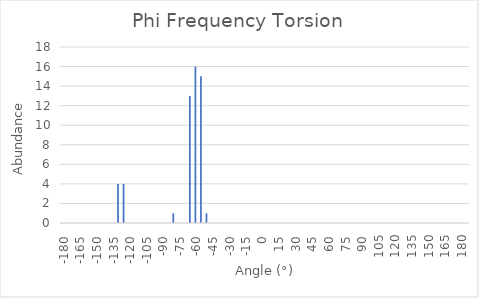
| Category | Series 0 |
|---|---|
| -180.0 | 0 |
| -175.0 | 0 |
| -170.0 | 0 |
| -165.0 | 0 |
| -160.0 | 0 |
| -155.0 | 0 |
| -150.0 | 0 |
| -145.0 | 0 |
| -140.0 | 0 |
| -135.0 | 0 |
| -130.0 | 4 |
| -125.0 | 4 |
| -120.0 | 0 |
| -115.0 | 0 |
| -110.0 | 0 |
| -105.0 | 0 |
| -100.0 | 0 |
| -95.0 | 0 |
| -90.0 | 0 |
| -85.0 | 0 |
| -80.0 | 1 |
| -75.0 | 0 |
| -70.0 | 0 |
| -65.0 | 13 |
| -60.0 | 16 |
| -55.0 | 15 |
| -50.0 | 1 |
| -45.0 | 0 |
| -40.0 | 0 |
| -35.0 | 0 |
| -30.0 | 0 |
| -25.0 | 0 |
| -20.0 | 0 |
| -15.0 | 0 |
| -10.0 | 0 |
| -5.0 | 0 |
| 0.0 | 0 |
| 5.0 | 0 |
| 10.0 | 0 |
| 15.0 | 0 |
| 20.0 | 0 |
| 25.0 | 0 |
| 30.0 | 0 |
| 35.0 | 0 |
| 40.0 | 0 |
| 45.0 | 0 |
| 50.0 | 0 |
| 55.0 | 0 |
| 60.0 | 0 |
| 65.0 | 0 |
| 70.0 | 0 |
| 75.0 | 0 |
| 80.0 | 0 |
| 85.0 | 0 |
| 90.0 | 0 |
| 95.0 | 0 |
| 100.0 | 0 |
| 105.0 | 0 |
| 110.0 | 0 |
| 115.0 | 0 |
| 120.0 | 0 |
| 125.0 | 0 |
| 130.0 | 0 |
| 135.0 | 0 |
| 140.0 | 0 |
| 145.0 | 0 |
| 150.0 | 0 |
| 155.0 | 0 |
| 160.0 | 0 |
| 165.0 | 0 |
| 170.0 | 0 |
| 175.0 | 0 |
| 180.0 | 0 |